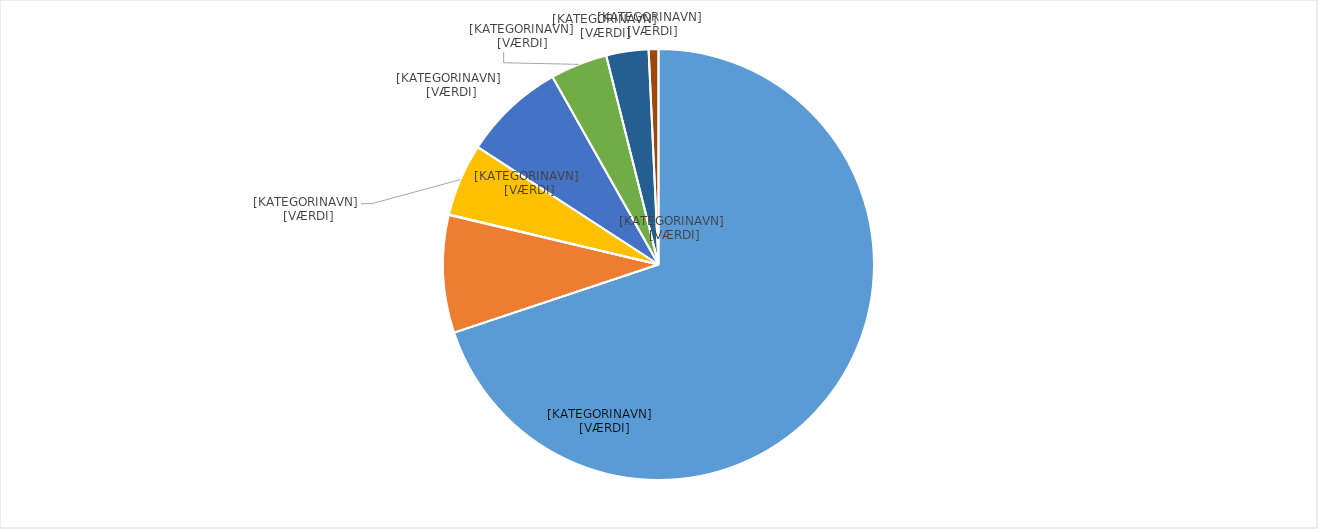
| Category | Series 0 |
|---|---|
| Gylle | 0.699 |
| Industriaffald | 0.088 |
| Spildevandsslam | 0 |
| Restprodukter og andet | 0.054 |
| Anden husdyrgødning | 0.076 |
| Energiafgrøder | 0.043 |
| Husholdningsaffald | 0.032 |
| Halm | 0.007 |